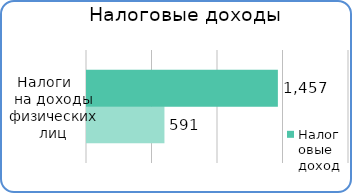
| Category | Факт | План  |
|---|---|---|
| Налоги на доходы физических лиц | 591200 | 1457100 |